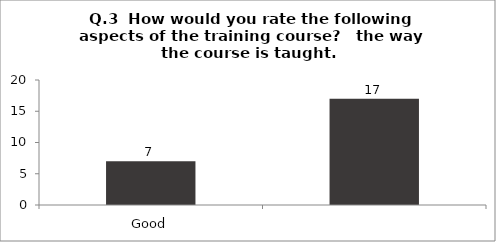
| Category | Q.3  How would you rate the following aspects of the training course?   the way the course is taught. |
|---|---|
| Good | 7 |
|  | 17 |